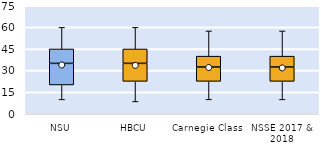
| Category | 25th | 50th | 75th |
|---|---|---|---|
| NSU | 20 | 15 | 10 |
| HBCU | 22.5 | 12.5 | 10 |
| Carnegie Class | 22.5 | 10 | 7.5 |
| NSSE 2017 & 2018 | 22.5 | 10 | 7.5 |